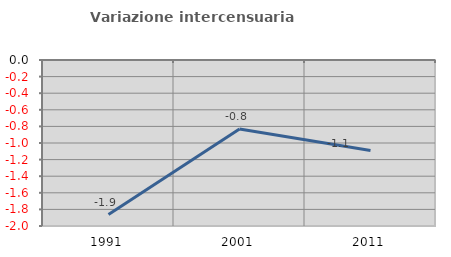
| Category | Variazione intercensuaria annua |
|---|---|
| 1991.0 | -1.862 |
| 2001.0 | -0.831 |
| 2011.0 | -1.091 |